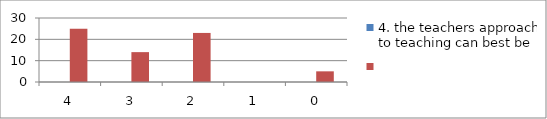
| Category | 4. the teachers approach to teaching can best be | Series 1 |
|---|---|---|
| 4.0 | 0 | 25 |
| 3.0 | 0 | 14 |
| 2.0 | 0 | 23 |
| 1.0 | 0 | 0 |
| 0.0 | 0 | 5 |